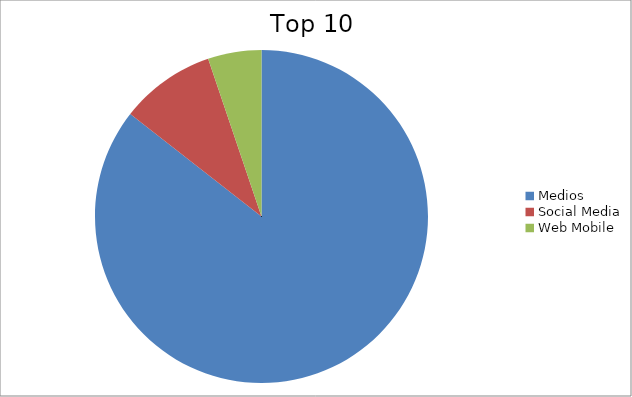
| Category | Series 0 |
|---|---|
| Medios | 85.55 |
| Social Media | 9.26 |
| Web Mobile | 5.19 |